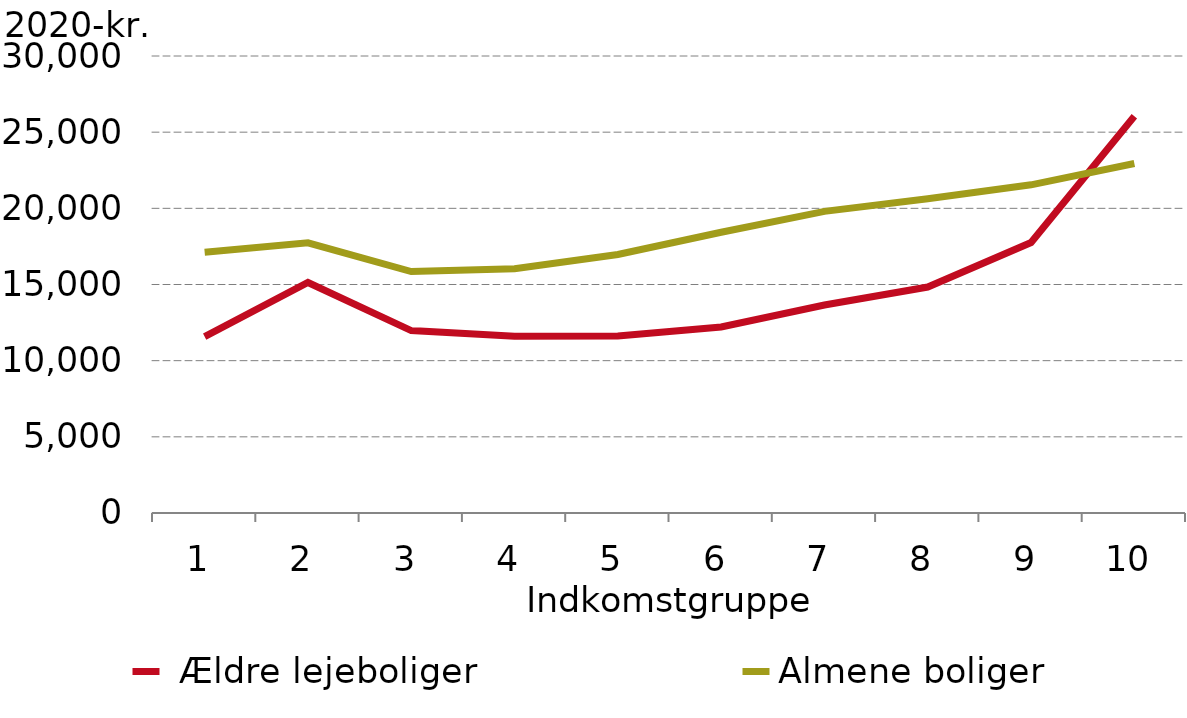
| Category |  Ældre lejeboliger |
|---|---|
| 0 | 11574.17 |
| 1 | 15130.073 |
| 2 | 11975.149 |
| 3 | 11604.383 |
| 4 | 11620.557 |
| 5 | 12210.026 |
| 6 | 13655.131 |
| 7 | 14834.229 |
| 8 | 17755.01 |
| 9 | 26042.967 |